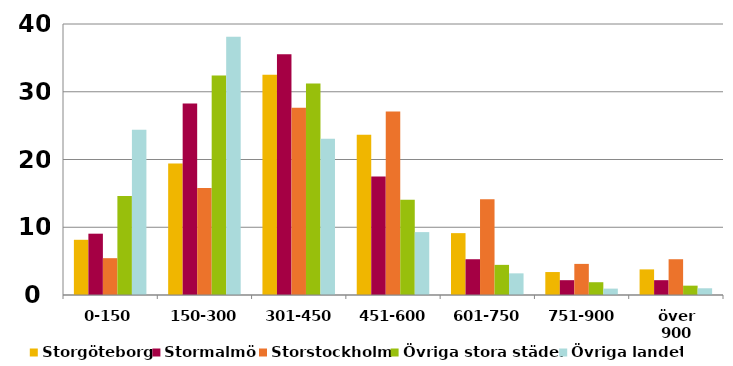
| Category | Storgöteborg | Stormalmö | Storstockholm | Övriga stora städer | Övriga landet |
|---|---|---|---|---|---|
| 0-150 | 8.149 | 9.05 | 5.434 | 14.6 | 24.402 |
| 150-300 | 19.391 | 28.281 | 15.804 | 32.415 | 38.121 |
| 301-450 | 32.499 | 35.52 | 27.653 | 31.23 | 23.064 |
| 451-600 | 23.662 | 17.496 | 27.102 | 14.044 | 9.282 |
| 601-750 | 9.131 | 5.279 | 14.136 | 4.448 | 3.197 |
| 751-900 | 3.387 | 2.187 | 4.592 | 1.885 | 0.942 |
| över 900 | 3.78 | 2.187 | 5.279 | 1.378 | 0.991 |